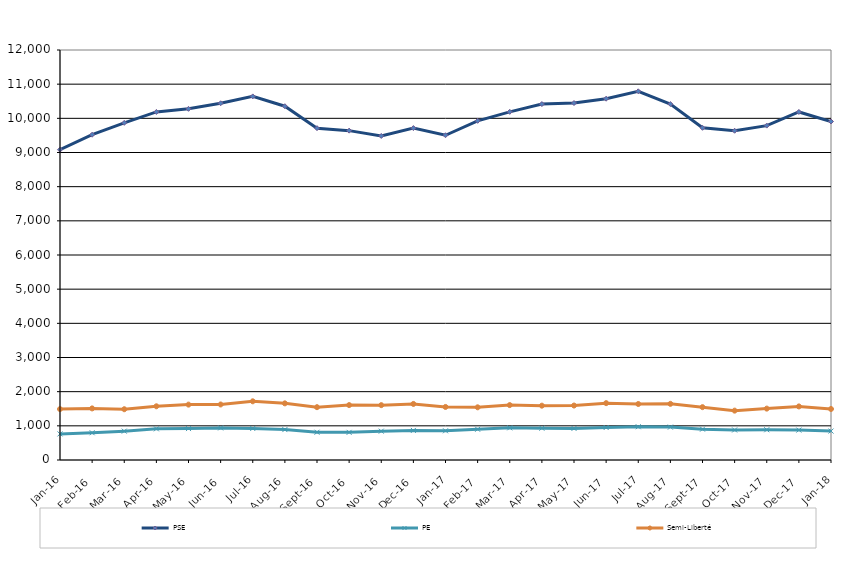
| Category | PSE | PE | Semi-Liberté |
|---|---|---|---|
| 2016-01-01 | 9081 | 764 | 1490 |
| 2016-02-01 | 9521 | 798 | 1510 |
| 2016-03-01 | 9868 | 845 | 1486 |
| 2016-04-01 | 10187 | 912 | 1572 |
| 2016-05-01 | 10278 | 920 | 1621 |
| 2016-06-01 | 10441 | 939 | 1625 |
| 2016-07-01 | 10642 | 923 | 1718 |
| 2016-08-01 | 10355 | 890 | 1658 |
| 2016-09-01 | 9712 | 813 | 1546 |
| 2016-10-01 | 9640 | 809 | 1607 |
| 2016-11-01 | 9484 | 844 | 1605 |
| 2016-12-01 | 9714 | 866 | 1641 |
| 2017-01-01 | 9505 | 855 | 1553 |
| 2017-02-01 | 9927 | 900 | 1542 |
| 2017-03-01 | 10190 | 942 | 1607 |
| 2017-04-01 | 10417 | 931 | 1590 |
| 2017-05-01 | 10448 | 924 | 1594 |
| 2017-06-01 | 10575 | 951 | 1664 |
| 2017-07-01 | 10791 | 974 | 1639 |
| 2017-08-01 | 10417 | 963 | 1644 |
| 2017-09-01 | 9723 | 903 | 1547 |
| 2017-10-01 | 9637 | 879 | 1445 |
| 2017-11-01 | 9787 | 885 | 1504 |
| 2017-12-01 | 10187 | 876 | 1568 |
| 2018-01-01 | 9907 | 847 | 1493 |